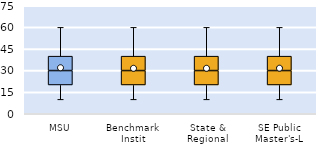
| Category | 25th | 50th | 75th |
|---|---|---|---|
| MSU | 20 | 10 | 10 |
| Benchmark Instit | 20 | 10 | 10 |
| State & Regional | 20 | 10 | 10 |
| SE Public Master's-L | 20 | 10 | 10 |